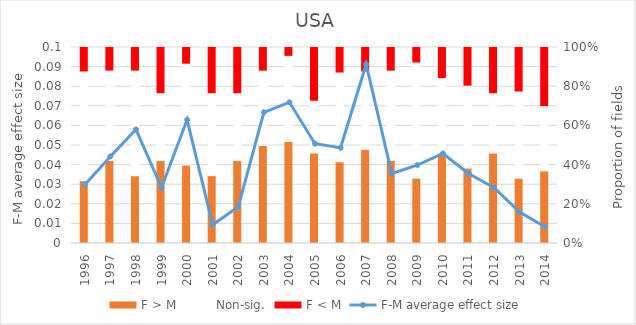
| Category | F > M | Non-sig. | F < M |
|---|---|---|---|
| 0 | 8 | 14 | 3 |
| 1 | 11 | 12 | 3 |
| 2 | 9 | 14 | 3 |
| 3 | 11 | 9 | 6 |
| 4 | 10 | 13 | 2 |
| 5 | 9 | 11 | 6 |
| 6 | 11 | 9 | 6 |
| 7 | 13 | 10 | 3 |
| 8 | 13 | 11 | 1 |
| 9 | 12 | 7 | 7 |
| 10 | 10 | 11 | 3 |
| 11 | 12 | 10 | 3 |
| 12 | 11 | 12 | 3 |
| 13 | 9 | 16 | 2 |
| 14 | 12 | 10 | 4 |
| 15 | 10 | 11 | 5 |
| 16 | 12 | 8 | 6 |
| 17 | 9 | 12 | 6 |
| 18 | 10 | 9 | 8 |